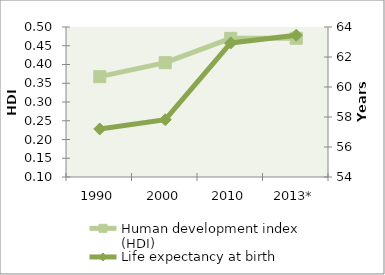
| Category | Human development index (HDI) |
|---|---|
| 1990 | 0.368 |
| 2000 | 0.405 |
| 2010 | 0.47 |
| 2013* | 0.47 |